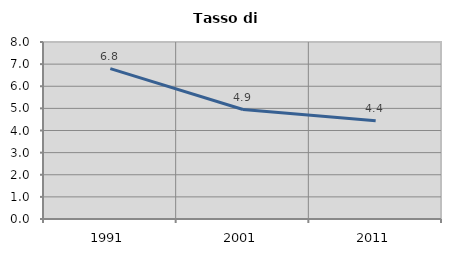
| Category | Tasso di disoccupazione   |
|---|---|
| 1991.0 | 6.795 |
| 2001.0 | 4.949 |
| 2011.0 | 4.444 |